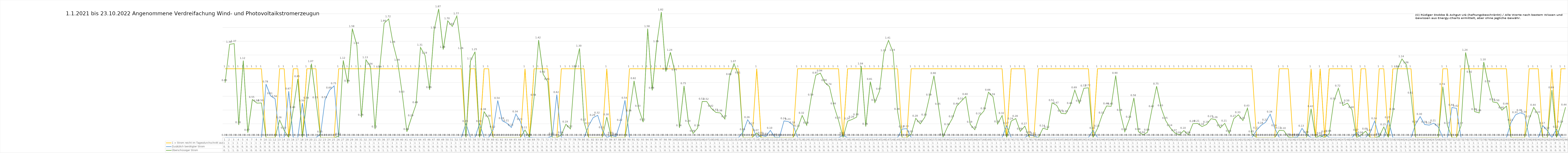
| Category | 1 = Strom reicht im Tagesdurchschnitt aus | Zusätzlich benötigter Strom | Überschüssiger Strom |
|---|---|---|---|
| 0 | 1 | 0 | 0.798 |
| 1 | 1 | 0 | 1.356 |
| 2 | 1 | 0 | 1.366 |
| 3 | 1 | 0 | 0.184 |
| 4 | 1 | 0 | 1.118 |
| 5 | 1 | 0 | 0.073 |
| 6 | 1 | 0 | 0.553 |
| 7 | 1 | 0 | 0.501 |
| 8 | 1 | 0 | 0.503 |
| 9 | 0 | 0.777 | 0 |
| 10 | 0 | 0.606 | 0 |
| 11 | 0 | 0.563 | 0 |
| 12 | 1 | 0 | 0.255 |
| 13 | 1 | 0 | 0.104 |
| 14 | 0 | 0.673 | 0 |
| 15 | 1 | 0 | 0.405 |
| 16 | 1 | 0 | 0.852 |
| 17 | 0 | 0.502 | 0 |
| 18 | 1 | 0 | 0.54 |
| 19 | 1 | 0 | 1.074 |
| 20 | 1 | 0 | 0.546 |
| 21 | 0 | 0.048 | 0 |
| 22 | 0 | 0.55 | 0 |
| 23 | 0 | 0.688 | 0 |
| 24 | 0 | 0.751 | 0 |
| 25 | 1 | 0 | 0.018 |
| 26 | 1 | 0 | 1.121 |
| 27 | 1 | 0 | 0.788 |
| 28 | 1 | 0 | 1.583 |
| 29 | 1 | 0 | 1.338 |
| 30 | 1 | 0 | 0.293 |
| 31 | 1 | 0 | 1.13 |
| 32 | 1 | 0 | 1.037 |
| 33 | 1 | 0 | 0.123 |
| 34 | 1 | 0 | 0.992 |
| 35 | 1 | 0 | 1.662 |
| 36 | 1 | 0 | 1.724 |
| 37 | 1 | 0 | 1.355 |
| 38 | 1 | 0 | 1.094 |
| 39 | 1 | 0 | 0.628 |
| 40 | 1 | 0 | 0.085 |
| 41 | 1 | 0 | 0.286 |
| 42 | 1 | 0 | 0.476 |
| 43 | 1 | 0 | 1.311 |
| 44 | 1 | 0 | 1.194 |
| 45 | 1 | 0 | 0.694 |
| 46 | 1 | 0 | 1.563 |
| 47 | 1 | 0 | 1.87 |
| 48 | 1 | 0 | 1.28 |
| 49 | 1 | 0 | 1.697 |
| 50 | 1 | 0 | 1.616 |
| 51 | 1 | 0 | 1.767 |
| 52 | 1 | 0 | 1.264 |
| 53 | 0 | 0.202 | 0 |
| 54 | 1 | 0 | 1.112 |
| 55 | 1 | 0 | 1.247 |
| 56 | 0 | 0.202 | 0 |
| 57 | 1 | 0 | 0.376 |
| 58 | 1 | 0 | 0.278 |
| 59 | 0 | 0.118 | 0 |
| 60 | 0 | 0.538 | 0 |
| 61 | 0 | 0.244 | 0 |
| 62 | 0 | 0.209 | 0 |
| 63 | 0 | 0.147 | 0 |
| 64 | 0 | 0.341 | 0 |
| 65 | 0 | 0.231 | 0 |
| 66 | 1 | 0 | 0.11 |
| 67 | 0 | 0.003 | 0 |
| 68 | 1 | 0 | 0.584 |
| 69 | 1 | 0 | 1.417 |
| 70 | 1 | 0 | 0.92 |
| 71 | 1 | 0 | 0.813 |
| 72 | 0 | 0.019 | 0 |
| 73 | 0 | 0.624 | 0 |
| 74 | 1 | 0 | 0.038 |
| 75 | 1 | 0 | 0.193 |
| 76 | 1 | 0 | 0.125 |
| 77 | 1 | 0 | 0.999 |
| 78 | 1 | 0 | 1.297 |
| 79 | 1 | 0 | 0.224 |
| 80 | 0 | 0.171 | 0 |
| 81 | 0 | 0.289 | 0 |
| 82 | 0 | 0.323 | 0 |
| 83 | 0 | 0.11 | 0 |
| 84 | 1 | 0 | 0.298 |
| 85 | 0 | 0.032 | 0 |
| 86 | 0 | 0.013 | 0 |
| 87 | 0 | 0.22 | 0 |
| 88 | 0 | 0.541 | 0 |
| 89 | 1 | 0 | 0.357 |
| 90 | 1 | 0 | 0.825 |
| 91 | 1 | 0 | 0.425 |
| 92 | 1 | 0 | 0.225 |
| 93 | 1 | 0 | 1.583 |
| 94 | 1 | 0 | 0.686 |
| 95 | 1 | 0 | 1.361 |
| 96 | 1 | 0 | 1.824 |
| 97 | 1 | 0 | 0.96 |
| 98 | 1 | 0 | 1.239 |
| 99 | 1 | 0 | 0.951 |
| 100 | 1 | 0 | 0.14 |
| 101 | 1 | 0 | 0.751 |
| 102 | 1 | 0 | 0.205 |
| 103 | 1 | 0 | 0.06 |
| 104 | 1 | 0 | 0.138 |
| 105 | 1 | 0 | 0.525 |
| 106 | 1 | 0 | 0.524 |
| 107 | 1 | 0 | 0.425 |
| 108 | 1 | 0 | 0.366 |
| 109 | 1 | 0 | 0.357 |
| 110 | 1 | 0 | 0.269 |
| 111 | 1 | 0 | 0.884 |
| 112 | 1 | 0 | 1.074 |
| 113 | 1 | 0 | 0.908 |
| 114 | 0 | 0.082 | 0 |
| 115 | 0 | 0.258 | 0 |
| 116 | 0 | 0.168 | 0 |
| 117 | 1 | 0 | 0.068 |
| 118 | 0 | 0.031 | 0 |
| 119 | 0 | 0.016 | 0 |
| 120 | 0 | 0.104 | 0 |
| 121 | 0 | 0.005 | 0 |
| 122 | 0 | 0.003 | 0 |
| 123 | 0 | 0.242 | 0 |
| 124 | 0 | 0.23 | 0 |
| 125 | 0 | 0.181 | 0 |
| 126 | 1 | 0 | 0.134 |
| 127 | 1 | 0 | 0.321 |
| 128 | 1 | 0 | 0.178 |
| 129 | 1 | 0 | 0.585 |
| 130 | 1 | 0 | 0.906 |
| 131 | 1 | 0 | 0.937 |
| 132 | 1 | 0 | 0.798 |
| 133 | 1 | 0 | 0.741 |
| 134 | 1 | 0 | 0.458 |
| 135 | 1 | 0 | 0.25 |
| 136 | 0 | 0.03 | 0 |
| 137 | 1 | 0 | 0.238 |
| 138 | 1 | 0 | 0.263 |
| 139 | 1 | 0 | 0.298 |
| 140 | 1 | 0 | 1.04 |
| 141 | 1 | 0 | 0.161 |
| 142 | 1 | 0 | 0.812 |
| 143 | 1 | 0 | 0.509 |
| 144 | 1 | 0 | 0.672 |
| 145 | 1 | 0 | 1.232 |
| 146 | 1 | 0 | 1.413 |
| 147 | 1 | 0 | 1.238 |
| 148 | 1 | 0 | 0.379 |
| 149 | 0 | 0.123 | 0 |
| 150 | 0 | 0.129 | 0 |
| 151 | 1 | 0 | 0.052 |
| 152 | 1 | 0 | 0.279 |
| 153 | 1 | 0 | 0.199 |
| 154 | 1 | 0 | 0.296 |
| 155 | 1 | 0 | 0.585 |
| 156 | 1 | 0 | 0.899 |
| 157 | 1 | 0 | 0.452 |
| 158 | 1 | 0 | 0.009 |
| 159 | 1 | 0 | 0.156 |
| 160 | 1 | 0 | 0.272 |
| 161 | 1 | 0 | 0.456 |
| 162 | 1 | 0 | 0.528 |
| 163 | 1 | 0 | 0.595 |
| 164 | 1 | 0 | 0.191 |
| 165 | 1 | 0 | 0.114 |
| 166 | 1 | 0 | 0.312 |
| 167 | 1 | 0 | 0.386 |
| 168 | 1 | 0 | 0.659 |
| 169 | 1 | 0 | 0.592 |
| 170 | 1 | 0 | 0.196 |
| 171 | 1 | 0 | 0.32 |
| 172 | 0 | 0.174 | 0 |
| 173 | 1 | 0 | 0.24 |
| 174 | 1 | 0 | 0.276 |
| 175 | 1 | 0 | 0.09 |
| 176 | 1 | 0 | 0.165 |
| 177 | 0 | 0.041 | 0 |
| 178 | 0 | 0.023 | 0 |
| 179 | 1 | 0 | 0 |
| 180 | 1 | 0 | 0.136 |
| 181 | 1 | 0 | 0.116 |
| 182 | 1 | 0 | 0.505 |
| 183 | 1 | 0 | 0.468 |
| 184 | 1 | 0 | 0.354 |
| 185 | 1 | 0 | 0.345 |
| 186 | 1 | 0 | 0.464 |
| 187 | 1 | 0 | 0.69 |
| 188 | 1 | 0 | 0.498 |
| 189 | 1 | 0 | 0.717 |
| 190 | 1 | 0 | 0.723 |
| 191 | 0 | 0.104 | 0 |
| 192 | 1 | 0 | 0.132 |
| 193 | 1 | 0 | 0.323 |
| 194 | 1 | 0 | 0.459 |
| 195 | 1 | 0 | 0.454 |
| 196 | 1 | 0 | 0.901 |
| 197 | 1 | 0 | 0.364 |
| 198 | 1 | 0 | 0.084 |
| 199 | 1 | 0 | 0.264 |
| 200 | 1 | 0 | 0.577 |
| 201 | 1 | 0 | 0.085 |
| 202 | 1 | 0 | 0.039 |
| 203 | 1 | 0 | 0.077 |
| 204 | 1 | 0 | 0.418 |
| 205 | 1 | 0 | 0.746 |
| 206 | 1 | 0 | 0.431 |
| 207 | 1 | 0 | 0.247 |
| 208 | 1 | 0 | 0.142 |
| 209 | 1 | 0 | 0.068 |
| 210 | 1 | 0 | 0.037 |
| 211 | 1 | 0 | 0.102 |
| 212 | 1 | 0 | 0.038 |
| 213 | 1 | 0 | 0.202 |
| 214 | 1 | 0 | 0.206 |
| 215 | 1 | 0 | 0.16 |
| 216 | 1 | 0 | 0.19 |
| 217 | 1 | 0 | 0.274 |
| 218 | 1 | 0 | 0.26 |
| 219 | 1 | 0 | 0.14 |
| 220 | 1 | 0 | 0.206 |
| 221 | 1 | 0 | 0.061 |
| 222 | 1 | 0 | 0.275 |
| 223 | 1 | 0 | 0.331 |
| 224 | 1 | 0 | 0.247 |
| 225 | 1 | 0 | 0.427 |
| 226 | 1 | 0 | 0.051 |
| 227 | 0 | 0.105 | 0 |
| 228 | 0 | 0.177 | 0 |
| 229 | 0 | 0.223 | 0 |
| 230 | 0 | 0.339 | 0 |
| 231 | 0 | 0.139 | 0 |
| 232 | 1 | 0 | 0.105 |
| 233 | 1 | 0 | 0.1 |
| 234 | 1 | 0 | 0.009 |
| 235 | 0 | 0.004 | 0 |
| 236 | 0 | 0.007 | 0 |
| 237 | 0 | 0.133 | 0 |
| 238 | 0 | 0.044 | 0 |
| 239 | 1 | 0 | 0.418 |
| 240 | 0 | 0.001 | 0 |
| 241 | 1 | 0 | 0.028 |
| 242 | 0 | 0.05 | 0 |
| 243 | 1 | 0 | 0.059 |
| 244 | 1 | 0 | 0.528 |
| 245 | 1 | 0 | 0.716 |
| 246 | 1 | 0 | 0.467 |
| 247 | 1 | 0 | 0.5 |
| 248 | 1 | 0 | 0.404 |
| 249 | 0 | 0.074 | 0 |
| 250 | 1 | 0 | 0.037 |
| 251 | 1 | 0 | 0.092 |
| 252 | 0 | 0.073 | 0 |
| 253 | 0 | 0.24 | 0 |
| 254 | 1 | 0 | 0.014 |
| 255 | 1 | 0 | 0.154 |
| 256 | 0 | 0.255 | 0 |
| 257 | 1 | 0 | 0.376 |
| 258 | 1 | 0 | 0.994 |
| 259 | 1 | 0 | 1.143 |
| 260 | 1 | 0 | 1.055 |
| 261 | 1 | 0 | 0.613 |
| 262 | 0 | 0.194 | 0 |
| 263 | 0 | 0.304 | 0 |
| 264 | 0 | 0.19 | 0 |
| 265 | 0 | 0.18 | 0 |
| 266 | 0 | 0.209 | 0 |
| 267 | 0 | 0.152 | 0 |
| 268 | 1 | 0 | 0.738 |
| 269 | 1 | 0 | 0.175 |
| 270 | 0 | 0.438 | 0 |
| 271 | 0 | 0.424 | 0 |
| 272 | 1 | 0 | 0.17 |
| 273 | 1 | 0 | 1.237 |
| 274 | 1 | 0 | 0.92 |
| 275 | 1 | 0 | 0.377 |
| 276 | 1 | 0 | 0.358 |
| 277 | 1 | 0 | 1.098 |
| 278 | 1 | 0 | 0.778 |
| 279 | 1 | 0 | 0.518 |
| 280 | 1 | 0 | 0.504 |
| 281 | 1 | 0 | 0.397 |
| 282 | 1 | 0 | 0.456 |
| 283 | 0 | 0.219 | 0 |
| 284 | 0 | 0.33 | 0 |
| 285 | 0 | 0.36 | 0 |
| 286 | 0 | 0.337 | 0 |
| 287 | 1 | 0 | 0.271 |
| 288 | 1 | 0 | 0.438 |
| 289 | 1 | 0 | 0.332 |
| 290 | 0 | 0.173 | 0 |
| 291 | 0 | 0.102 | 0 |
| 292 | 1 | 0 | 0.69 |
| 293 | 0 | 0.12 | 0 |
| 294 | 1 | 0 | 0.192 |
| 295 | 1 | 0 | 0.441 |